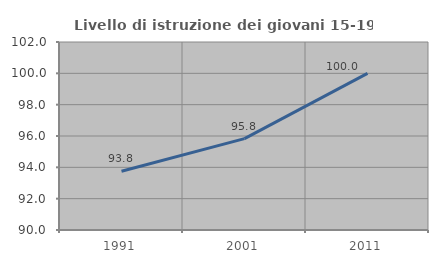
| Category | Livello di istruzione dei giovani 15-19 anni |
|---|---|
| 1991.0 | 93.75 |
| 2001.0 | 95.833 |
| 2011.0 | 100 |